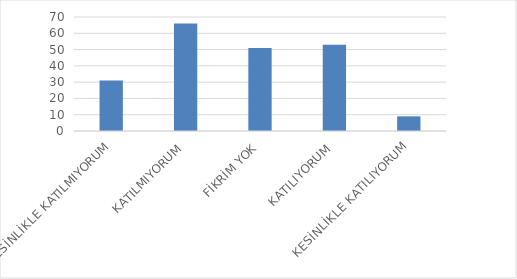
| Category | Series 0 |
|---|---|
| KESİNLİKLE KATILMIYORUM | 31 |
| KATILMIYORUM | 66 |
| FİKRİM YOK | 51 |
| KATILIYORUM | 53 |
| KESİNLİKLE KATILIYORUM | 9 |